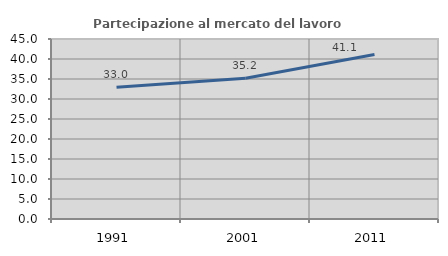
| Category | Partecipazione al mercato del lavoro  femminile |
|---|---|
| 1991.0 | 32.966 |
| 2001.0 | 35.199 |
| 2011.0 | 41.149 |